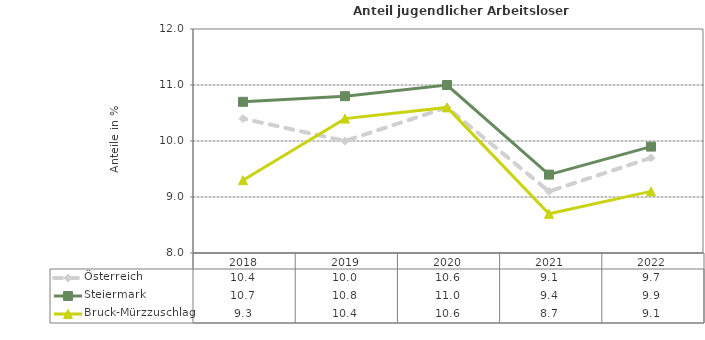
| Category | Österreich | Steiermark | Bruck-Mürzzuschlag |
|---|---|---|---|
| 2022.0 | 9.7 | 9.9 | 9.1 |
| 2021.0 | 9.1 | 9.4 | 8.7 |
| 2020.0 | 10.6 | 11 | 10.6 |
| 2019.0 | 10 | 10.8 | 10.4 |
| 2018.0 | 10.4 | 10.7 | 9.3 |